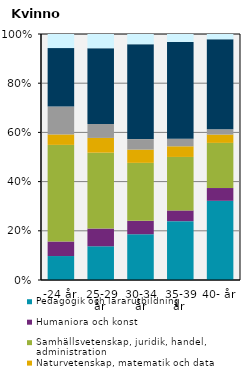
| Category | Pedagogik och lärarutbildning | Humaniora och konst | Samhällsvetenskap, juridik, handel, administration | Naturvetenskap, matematik och data | Teknik och tillverkning | Hälso- och sjukvård samt social omsorg | Övriga |
|---|---|---|---|---|---|---|---|
| -24 år | 9.788 | 5.93 | 39.474 | 4.273 | 11.361 | 23.91 | 5.757 |
| 25-29 år  | 13.82 | 7.257 | 31.086 | 6.058 | 5.694 | 31.056 | 5.829 |
| 30-34 år | 18.726 | 5.502 | 23.683 | 5.444 | 4.285 | 38.816 | 4.178 |
| 35-39 år  | 24.062 | 4.383 | 21.87 | 4.353 | 3.062 | 39.628 | 3.227 |
| 40- år | 32.295 | 5.205 | 18.419 | 3.394 | 2.132 | 36.724 | 2.142 |